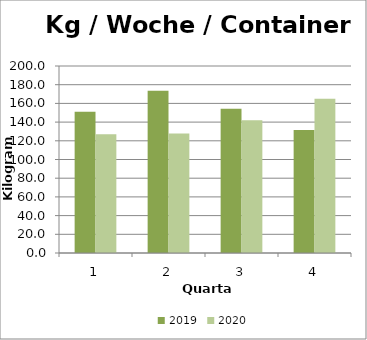
| Category | 2019 | 2020 |
|---|---|---|
| 0 | 151.154 | 126.923 |
| 1 | 173.462 | 127.692 |
| 2 | 154.231 | 141.923 |
| 3 | 131.538 | 165 |